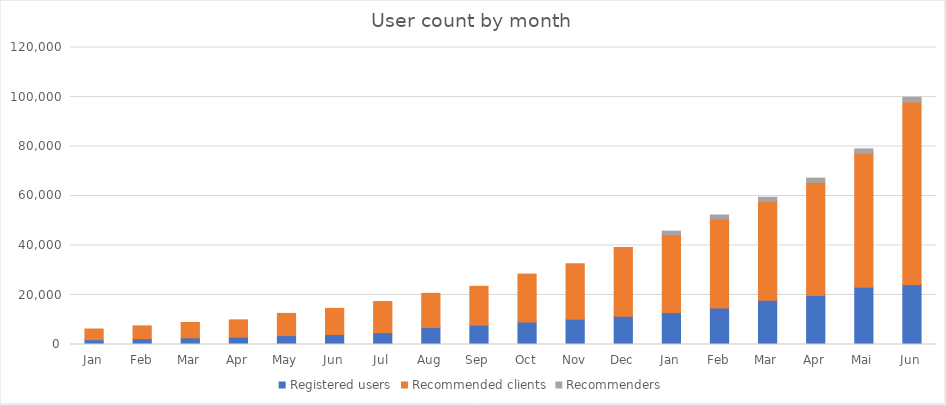
| Category | Registered users | Recommended clients | Recommenders |
|---|---|---|---|
| Jan | 1959 | 4295 | 0 |
| Feb | 2320 | 5194 | 0 |
| Mar | 2664 | 6226 | 0 |
| Apr | 3006 | 6944 | 0 |
| May | 3586 | 8993 | 0 |
| Jun | 4026 | 10554 | 0 |
| Jul | 4756 | 12593 | 0 |
| Aug | 6820 | 13848 | 0 |
| Sep | 7790 | 15720 | 0 |
| Oct | 9079 | 19370 | 0 |
| Nov | 10242 | 22339 | 0 |
| Dec | 11387 | 27841 | 0 |
| Jan | 12887 | 31519 | 1390 |
| Feb | 14703 | 36012 | 1598 |
| Mar | 17886 | 39952 | 1653 |
| Apr | 19840 | 45685 | 1704 |
| Mai | 23126 | 54088 | 1826 |
| Jun | 24253 | 73743 | 1888 |